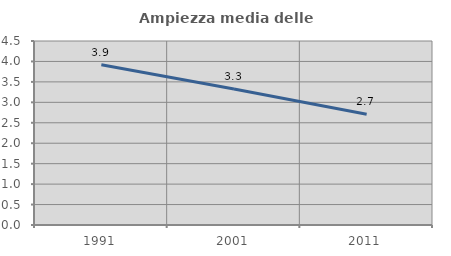
| Category | Ampiezza media delle famiglie |
|---|---|
| 1991.0 | 3.918 |
| 2001.0 | 3.327 |
| 2011.0 | 2.706 |